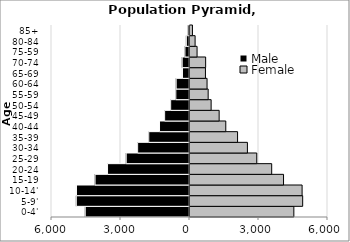
| Category | Male | Female |
|---|---|---|
| 0-4' | -4533.41 | 4515.2 |
| 5-9' | -4921.72 | 4899.22 |
| 10-14' | -4913.78 | 4874.3 |
| 15-19 | -4106.6 | 4066.7 |
| 20-24 | -3563.24 | 3551.8 |
| 25-29 | -2751.46 | 2902.75 |
| 30-34 | -2255.35 | 2496.21 |
| 35-39 | -1771.28 | 2068.21 |
| 40-44 | -1303.55 | 1556.11 |
| 45-49 | -1081.07 | 1267.65 |
| 50-54 | -819 | 918.63 |
| 55-59 | -594.79 | 789.74 |
| 60-64 | -579.68 | 741.56 |
| 65-69 | -306.1 | 671.35 |
| 70-74 | -318.57 | 680.05 |
| 75-59 | -198.95 | 307.34 |
| 80-84 | -136.94 | 221.73 |
| 85+ | -74.92 | 106.55 |